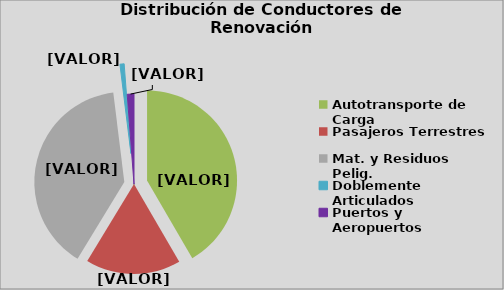
| Category | Series 0 |
|---|---|
| Autotransporte de Carga | 41.614 |
| Pasajeros Terrestres | 17.081 |
| Mat. y Residuos Pelig. | 39.345 |
| Doblemente Articulados | 0.753 |
| Puertos y Aeropuertos | 1.207 |